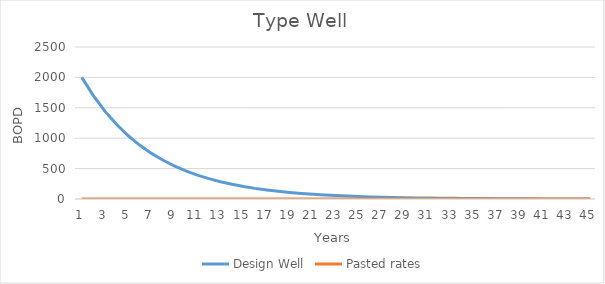
| Category | Design Well | Pasted rates |
|---|---|---|
| 1.0 | 2000 | 0 |
| 2.0 | 1700 | 0 |
| 3.0 | 1445 | 0 |
| 4.0 | 1228.25 | 0 |
| 5.0 | 1044.012 | 0 |
| 6.0 | 887.411 | 0 |
| 7.0 | 754.299 | 0 |
| 8.0 | 641.154 | 0 |
| 9.0 | 544.981 | 0 |
| 10.0 | 463.234 | 0 |
| 11.0 | 393.749 | 0 |
| 12.0 | 334.686 | 0 |
| 13.0 | 284.484 | 0 |
| 14.0 | 241.811 | 0 |
| 15.0 | 205.539 | 0 |
| 16.0 | 174.708 | 0 |
| 17.0 | 148.502 | 0 |
| 18.0 | 126.227 | 0 |
| 19.0 | 107.293 | 0 |
| 20.0 | 91.199 | 0 |
| 21.0 | 77.519 | 0 |
| 22.0 | 65.891 | 0 |
| 23.0 | 56.008 | 0 |
| 24.0 | 47.606 | 0 |
| 25.0 | 40.465 | 0 |
| 26.0 | 34.396 | 0 |
| 27.0 | 29.236 | 0 |
| 28.0 | 24.851 | 0 |
| 29.0 | 21.123 | 0 |
| 30.0 | 17.955 | 0 |
| 31.0 | 15.262 | 0 |
| 32.0 | 12.972 | 0 |
| 33.0 | 11.026 | 0 |
| 34.0 | 9.372 | 0 |
| 35.0 | 7.967 | 0 |
| 36.0 | 6.772 | 0 |
| 37.0 | 5.756 | 0 |
| 38.0 | 4.892 | 0 |
| 39.0 | 4.159 | 0 |
| 40.0 | 3.535 | 0 |
| 41.0 | 0 | 0 |
| 42.0 | 0 | 0 |
| 43.0 | 0 | 0 |
| 44.0 | 0 | 0 |
| 45.0 | 0 | 0 |